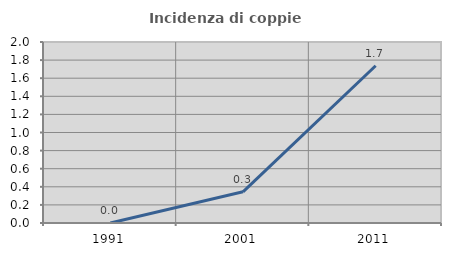
| Category | Incidenza di coppie miste |
|---|---|
| 1991.0 | 0 |
| 2001.0 | 0.345 |
| 2011.0 | 1.738 |